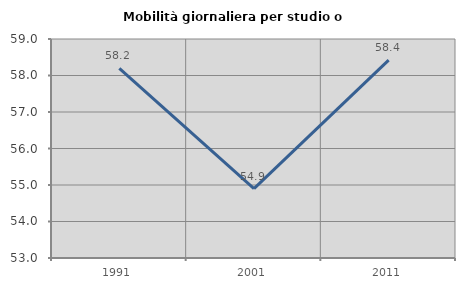
| Category | Mobilità giornaliera per studio o lavoro |
|---|---|
| 1991.0 | 58.198 |
| 2001.0 | 54.9 |
| 2011.0 | 58.419 |